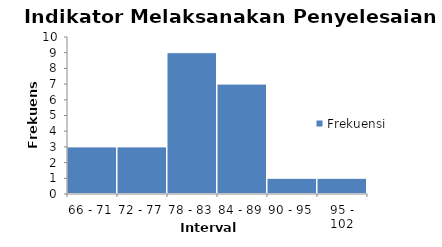
| Category | Frekuensi |
|---|---|
| 66 - 71 | 3 |
| 72 - 77 | 3 |
| 78 - 83 | 9 |
| 84 - 89 | 7 |
| 90 - 95 | 1 |
| 95 - 102 | 1 |